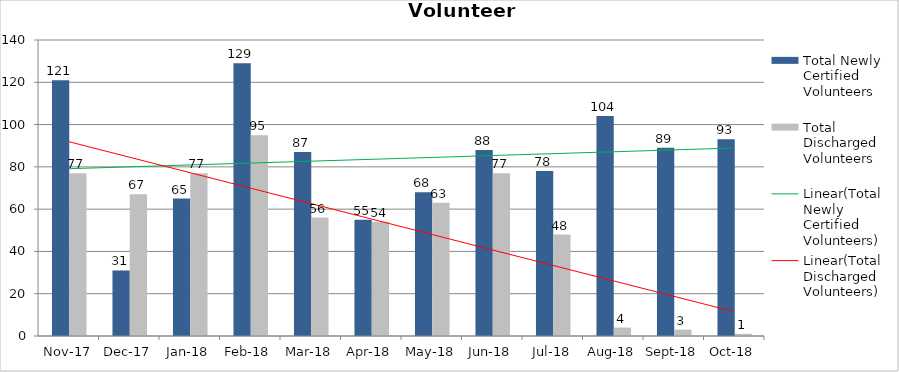
| Category | Total Newly Certified Volunteers | Total Discharged Volunteers |
|---|---|---|
| 2017-11-01 | 121 | 77 |
| 2017-12-01 | 31 | 67 |
| 2018-01-01 | 65 | 77 |
| 2018-02-01 | 129 | 95 |
| 2018-03-01 | 87 | 56 |
| 2018-04-01 | 55 | 54 |
| 2018-05-01 | 68 | 63 |
| 2018-06-01 | 88 | 77 |
| 2018-07-01 | 78 | 48 |
| 2018-08-01 | 104 | 4 |
| 2018-09-01 | 89 | 3 |
| 2018-10-01 | 93 | 1 |